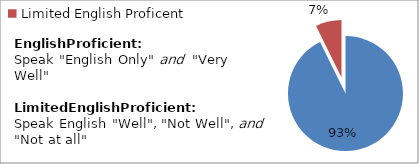
| Category | Percent |
|---|---|
| English Proficient | 0.927 |
| Limited English Proficent | 0.073 |